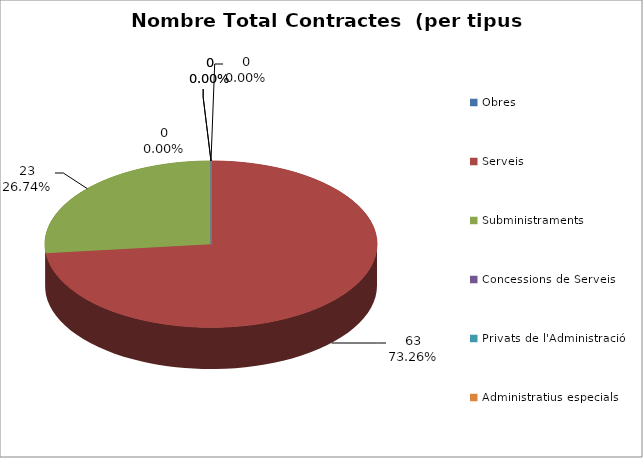
| Category | Nombre Total Contractes |
|---|---|
| Obres | 0 |
| Serveis | 63 |
| Subministraments | 23 |
| Concessions de Serveis | 0 |
| Privats de l'Administració | 0 |
| Administratius especials | 0 |